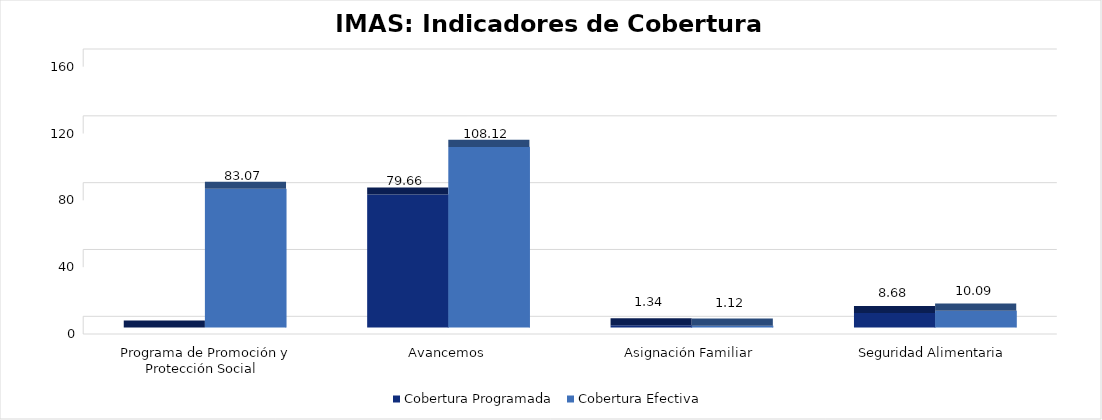
| Category | Cobertura Programada | Cobertura Efectiva |
|---|---|---|
| Programa de Promoción y Protección Social | 0 | 83.075 |
| Avancemos | 79.655 | 108.122 |
| Asignación Familiar | 1.344 | 1.12 |
| Seguridad Alimentaria | 8.684 | 10.086 |